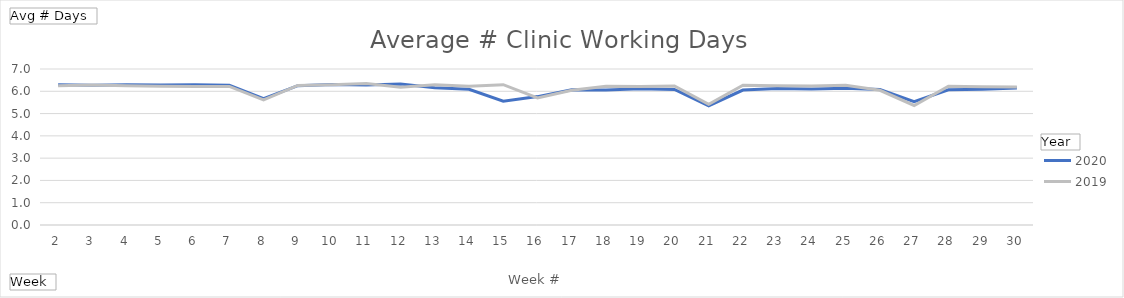
| Category | 2020 | 2019 |
|---|---|---|
| 2 | 6.295 | 6.25 |
| 3 | 6.273 | 6.284 |
| 4 | 6.295 | 6.25 |
| 5 | 6.284 | 6.227 |
| 6 | 6.295 | 6.216 |
| 7 | 6.273 | 6.216 |
| 8 | 5.67 | 5.614 |
| 9 | 6.25 | 6.261 |
| 10 | 6.307 | 6.295 |
| 11 | 6.284 | 6.352 |
| 12 | 6.33 | 6.182 |
| 13 | 6.159 | 6.295 |
| 14 | 6.091 | 6.227 |
| 15 | 5.557 | 6.295 |
| 16 | 5.761 | 5.705 |
| 17 | 6.068 | 6.045 |
| 18 | 6.057 | 6.227 |
| 19 | 6.114 | 6.216 |
| 20 | 6.08 | 6.239 |
| 21 | 5.352 | 5.42 |
| 22 | 6.057 | 6.273 |
| 23 | 6.125 | 6.25 |
| 24 | 6.102 | 6.239 |
| 25 | 6.136 | 6.273 |
| 26 | 6.08 | 6.045 |
| 27 | 5.534 | 5.364 |
| 28 | 6.068 | 6.227 |
| 29 | 6.091 | 6.205 |
| 30 | 6.148 | 6.193 |